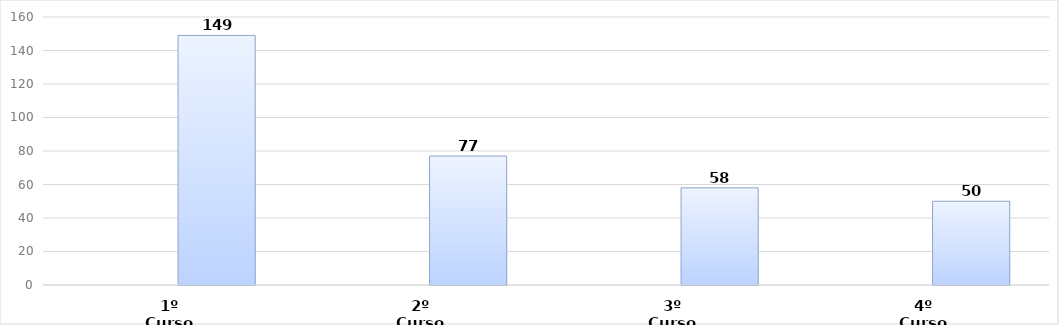
| Category | Series 0 | Series 1 |
|---|---|---|
| 1º Curso |  | 149 |
| 2º Curso |  | 77 |
| 3º Curso |  | 58 |
| 4º Curso |  | 50 |